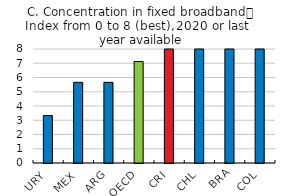
| Category | Series 0 |
|---|---|
| URY | 3.33 |
| MEX | 5.66 |
| ARG | 5.66 |
| OECD | 7.12 |
| CRI | 8 |
| CHL | 8 |
| BRA | 8 |
| COL | 8 |